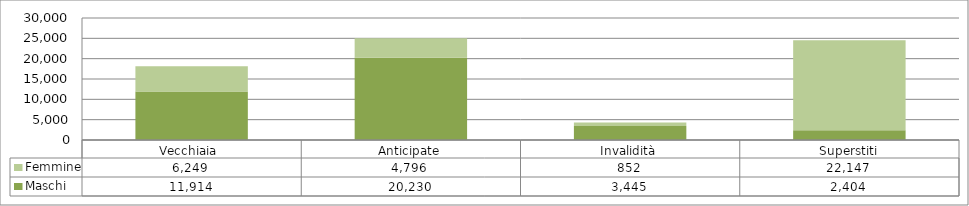
| Category | Maschi | Femmine |
|---|---|---|
| Vecchiaia  | 11914 | 6249 |
| Anticipate | 20230 | 4796 |
| Invalidità | 3445 | 852 |
| Superstiti | 2404 | 22147 |